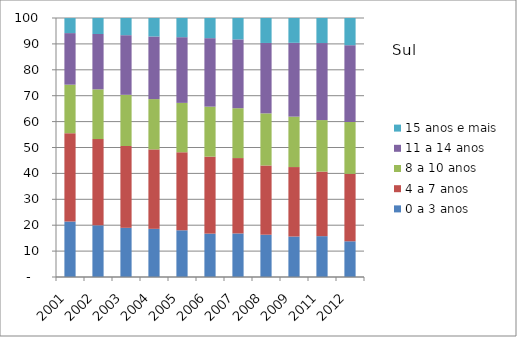
| Category | 0 a 3 anos | 4 a 7 anos | 8 a 10 anos | 11 a 14 anos | 15 anos e mais |
|---|---|---|---|---|---|
| 2001.0 | 21.42 | 34.09 | 18.75 | 19.91 | 5.81 |
| 2002.0 | 19.94 | 33.31 | 19.21 | 21.36 | 6.18 |
| 2003.0 | 18.99 | 31.58 | 19.77 | 23.02 | 6.64 |
| 2004.0 | 18.6 | 30.67 | 19.42 | 24.17 | 7.14 |
| 2005.0 | 18.04 | 30.12 | 19.07 | 25.36 | 7.41 |
| 2006.0 | 16.75 | 29.72 | 19.31 | 26.43 | 7.8 |
| 2007.0 | 16.82 | 29.1 | 19.25 | 26.57 | 8.27 |
| 2008.0 | 16.33 | 26.72 | 20.13 | 27.18 | 9.65 |
| 2009.0 | 15.63 | 26.82 | 19.47 | 28.5 | 9.58 |
| 2011.0 | 15.77 | 24.93 | 19.89 | 29.74 | 9.67 |
| 2012.0 | 13.79 | 26.03 | 20.02 | 29.65 | 10.51 |